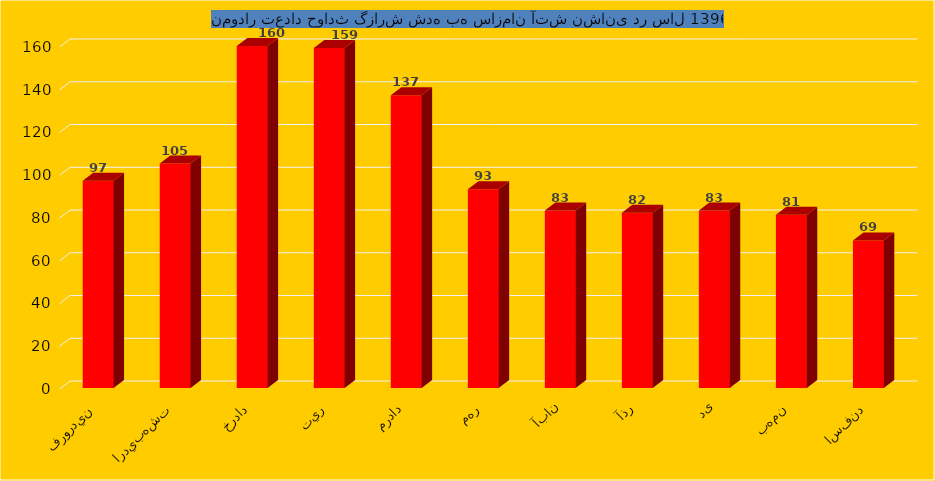
| Category | Series 0 |
|---|---|
| فروردين | 97 |
| ارديبهشت | 105 |
| خرداد | 160 |
| تير  | 159 |
| مرداد | 137 |
| مهر | 93 |
| آبان | 83 |
| آذر | 82 |
| دی | 83 |
| بهمن | 81 |
| اسفند | 69 |